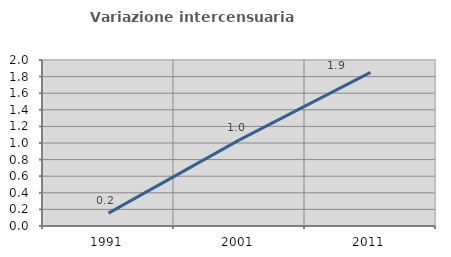
| Category | Variazione intercensuaria annua |
|---|---|
| 1991.0 | 0.155 |
| 2001.0 | 1.038 |
| 2011.0 | 1.852 |